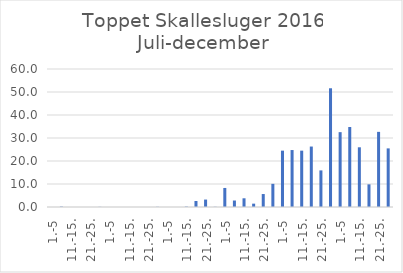
| Category | Series 0 |
|---|---|
| 1.-5 | 0 |
| 6.-10. | 0.173 |
| 11.-15. | 0 |
| 16.-20. | 0 |
| 21.-25. | 0 |
| 26.-31. | 0.063 |
| 1.-5 | 0 |
| 6.-10. | 0 |
| 11.-15. | 0 |
| 16.-20. | 0 |
| 21.-25. | 0 |
| 26.-31. | 0.074 |
| 1.-5 | 0 |
| 6.-10. | 0 |
| 11.-15. | 0.174 |
| 16.-20. | 2.605 |
| 21.-25. | 3.23 |
| 26.-30. | 0.086 |
| 1.-5 | 8.279 |
| 6.-10. | 2.819 |
| 11.-15. | 3.788 |
| 16.-20. | 1.455 |
| 21.-25. | 5.637 |
| 26.-31. | 10.071 |
| 1.-5 | 24.503 |
| 6.-10. | 24.764 |
| 11.-15. | 24.5 |
| 16.-20. | 26.287 |
| 21.-25. | 15.914 |
| 26.-30. | 51.624 |
| 1.-5 | 32.544 |
| 6.-10. | 34.778 |
| 11.-15. | 25.961 |
| 16.-20. | 9.843 |
| 21.-25. | 32.67 |
| 26.-31. | 25.485 |